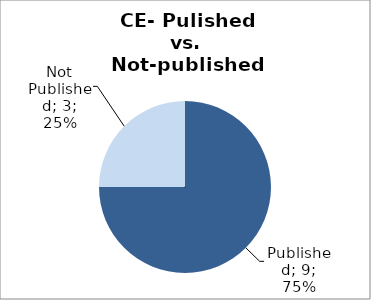
| Category | Series 0 |
|---|---|
| Published | 9 |
| Not Published | 3 |